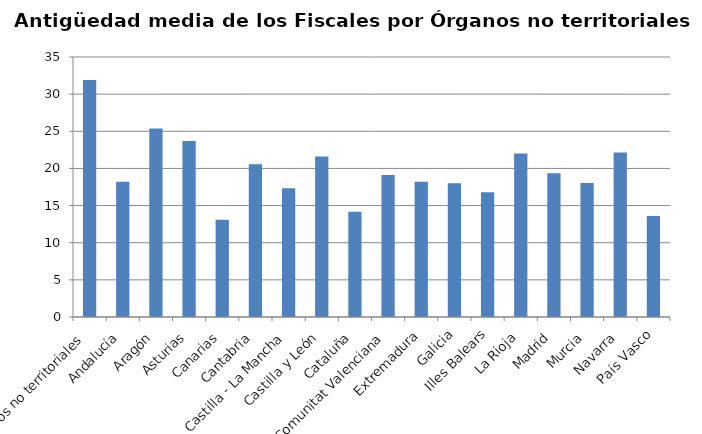
| Category | Series 0 |
|---|---|
| Órganos no territoriales | 31.92 |
| Andalucía | 18.19 |
| Aragón | 25.37 |
| Asturias | 23.69 |
| Canarias | 13.1 |
| Cantabria | 20.56 |
| Castilla - La Mancha | 17.34 |
| Castilla y León | 21.59 |
| Cataluña | 14.18 |
| Comunitat Valenciana | 19.1 |
| Extremadura | 18.21 |
| Galicia | 17.99 |
| Illes Balears | 16.81 |
| La Rioja | 22 |
| Madrid | 19.34 |
| Murcia | 18.05 |
| Navarra | 22.14 |
| País Vasco | 13.58 |